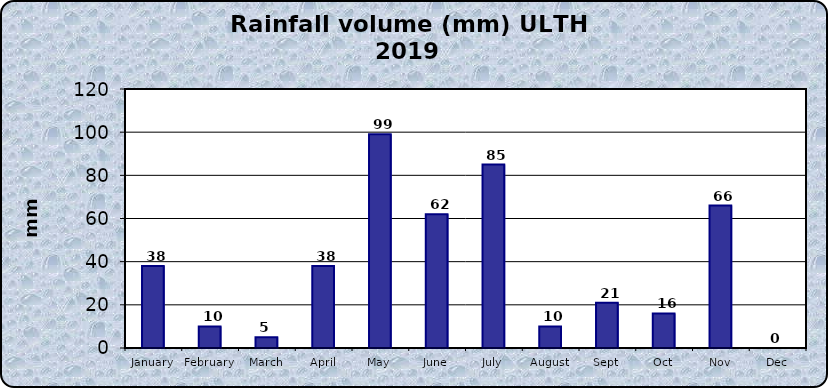
| Category | Series 0 |
|---|---|
| January | 38 |
| February | 10 |
| March | 5 |
| April | 38 |
| May | 99 |
| June | 62 |
| July | 85 |
| August | 10 |
| Sept | 21 |
| Oct | 16 |
| Nov | 66 |
| Dec | 0 |